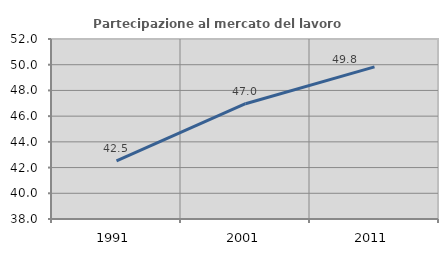
| Category | Partecipazione al mercato del lavoro  femminile |
|---|---|
| 1991.0 | 42.521 |
| 2001.0 | 46.966 |
| 2011.0 | 49.833 |